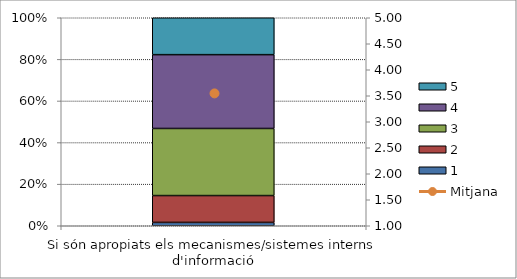
| Category | 1 | 2 | 3 | 4 | 5 |
|---|---|---|---|---|---|
| Si són apropiats els mecanismes/sistemes interns d'informació | 1 | 8 | 20 | 22 | 11 |